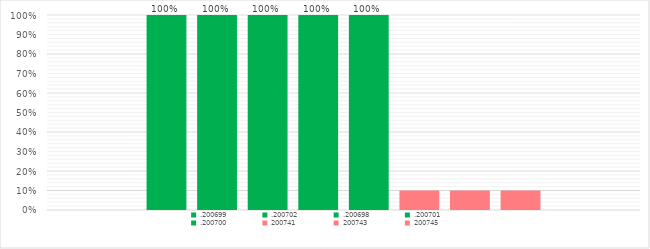
| Category | .200699 | .200702 | .200698 | .200701 | .200700 | 200741 | 200743 | 200745 |
|---|---|---|---|---|---|---|---|---|
| 0 | 1 | 1 | 1 | 1 | 1 | 0.1 | 0.1 | 0.1 |